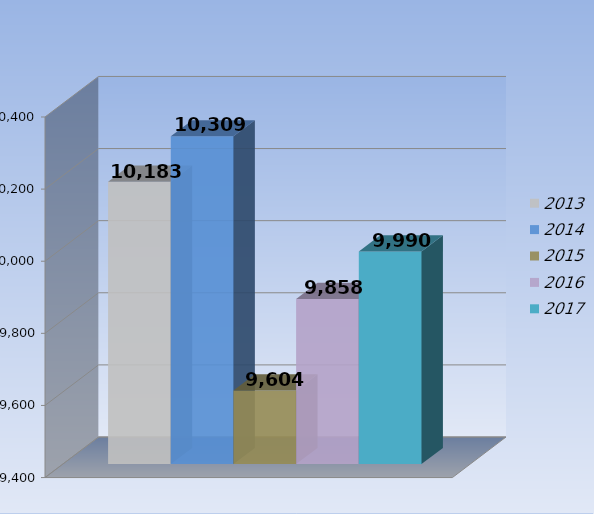
| Category | 2013 | 2014 | 2015 | 2016 | 2017 |
|---|---|---|---|---|---|
| 0 | 10183 | 10309 | 9604 | 9858 | 9990 |